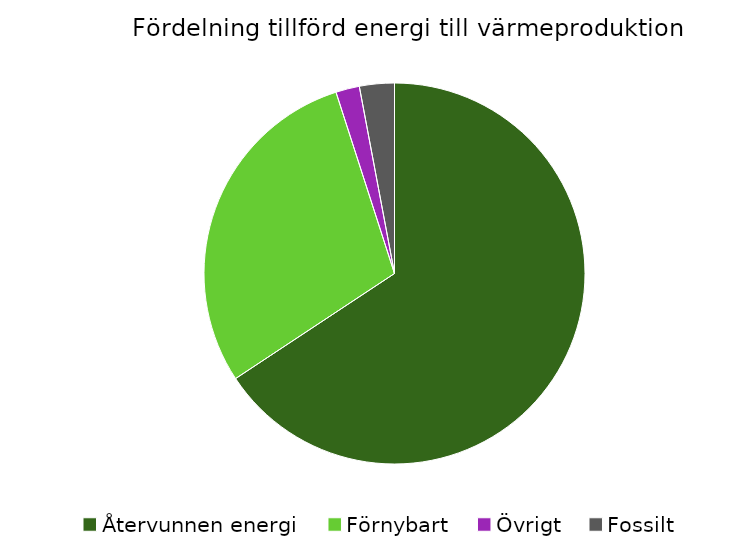
| Category | Fördelning värmeproduktion |
|---|---|
| Återvunnen energi | 0.657 |
| Förnybart | 0.293 |
| Övrigt | 0.02 |
| Fossilt | 0.03 |